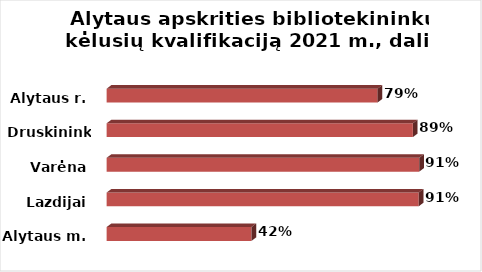
| Category | Series 0 |
|---|---|
| Alytaus m. | 0.423 |
| Lazdijai | 0.912 |
| Varėna | 0.913 |
| Druskininkai | 0.895 |
| Alytaus r. | 0.792 |